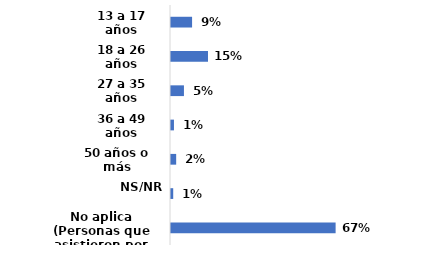
| Category | Series 0 |
|---|---|
| 13 a 17 años | 0.086 |
| 18 a 26 años | 0.15 |
| 27 a 35 años | 0.053 |
| 36 a 49 años | 0.012 |
| 50 años o más | 0.021 |
| NS/NR | 0.009 |
| No aplica (Personas que asistieron por primera vez) | 0.669 |